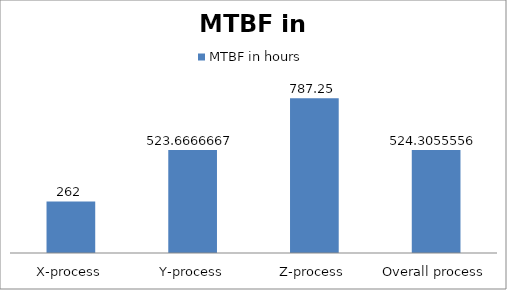
| Category | MTBF in hours |
|---|---|
| X-process | 262 |
| Y-process | 523.667 |
| Z-process | 787.25 |
| Overall process | 524.306 |